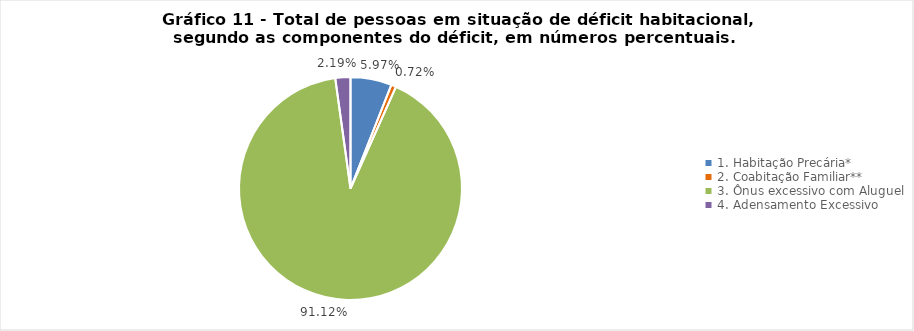
| Category | Series 0 |
|---|---|
| 0 | 0.06 |
| 1 | 0.007 |
| 2 | 0.911 |
| 3 | 0.022 |